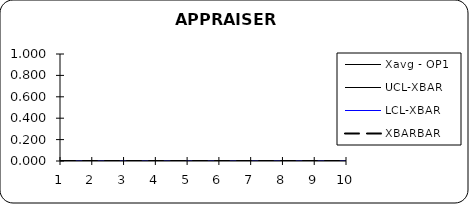
| Category | Xavg - OP1 | UCL-XBAR | LCL-XBAR | XBARBAR |
|---|---|---|---|---|
| 0 | 0 | 0 | 0 | 0 |
| 1 | 0 | 0 | 0 | 0 |
| 2 | 0 | 0 | 0 | 0 |
| 3 | 0 | 0 | 0 | 0 |
| 4 | 0 | 0 | 0 | 0 |
| 5 | 0 | 0 | 0 | 0 |
| 6 | 0 | 0 | 0 | 0 |
| 7 | 0 | 0 | 0 | 0 |
| 8 | 0 | 0 | 0 | 0 |
| 9 | 0 | 0 | 0 | 0 |